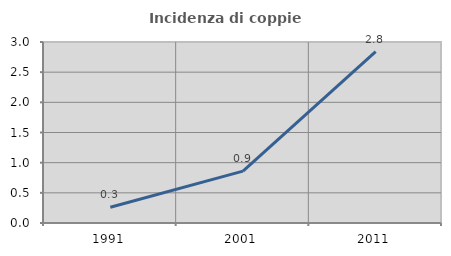
| Category | Incidenza di coppie miste |
|---|---|
| 1991.0 | 0.26 |
| 2001.0 | 0.86 |
| 2011.0 | 2.839 |